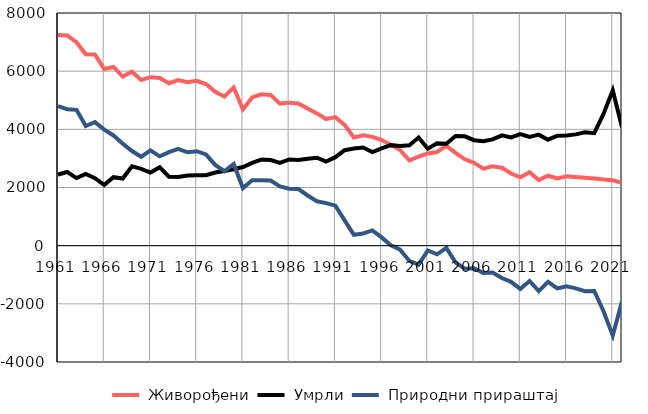
| Category |  Живорођени |  Умрли |  Природни прираштај |
|---|---|---|---|
| 1961.0 | 7244 | 2448 | 4796 |
| 1962.0 | 7228 | 2534 | 4694 |
| 1963.0 | 6995 | 2325 | 4670 |
| 1964.0 | 6582 | 2469 | 4113 |
| 1965.0 | 6571 | 2322 | 4249 |
| 1966.0 | 6076 | 2087 | 3989 |
| 1967.0 | 6144 | 2355 | 3789 |
| 1968.0 | 5815 | 2307 | 3508 |
| 1969.0 | 5981 | 2727 | 3254 |
| 1970.0 | 5699 | 2642 | 3057 |
| 1971.0 | 5793 | 2516 | 3277 |
| 1972.0 | 5768 | 2696 | 3072 |
| 1973.0 | 5585 | 2369 | 3216 |
| 1974.0 | 5692 | 2362 | 3330 |
| 1975.0 | 5623 | 2411 | 3212 |
| 1976.0 | 5668 | 2421 | 3247 |
| 1977.0 | 5557 | 2421 | 3136 |
| 1978.0 | 5292 | 2515 | 2777 |
| 1979.0 | 5127 | 2569 | 2558 |
| 1980.0 | 5441 | 2630 | 2811 |
| 1981.0 | 4685 | 2705 | 1980 |
| 1982.0 | 5097 | 2846 | 2251 |
| 1983.0 | 5206 | 2960 | 2246 |
| 1984.0 | 5180 | 2942 | 2238 |
| 1985.0 | 4885 | 2848 | 2037 |
| 1986.0 | 4918 | 2963 | 1955 |
| 1987.0 | 4891 | 2944 | 1947 |
| 1988.0 | 4716 | 2990 | 1726 |
| 1989.0 | 4548 | 3023 | 1525 |
| 1990.0 | 4353 | 2890 | 1463 |
| 1991.0 | 4419 | 3043 | 1376 |
| 1992.0 | 4154 | 3283 | 871 |
| 1993.0 | 3719 | 3344 | 375 |
| 1994.0 | 3795 | 3374 | 421 |
| 1995.0 | 3742 | 3216 | 526 |
| 1996.0 | 3631 | 3347 | 284 |
| 1997.0 | 3468 | 3456 | 12 |
| 1998.0 | 3286 | 3426 | -140 |
| 1999.0 | 2930 | 3454 | -524 |
| 2000.0 | 3064 | 3717 | -653 |
| 2001.0 | 3171 | 3334 | -163 |
| 2002.0 | 3221 | 3517 | -296 |
| 2003.0 | 3431 | 3507 | -76 |
| 2004.0 | 3189 | 3771 | -582 |
| 2005.0 | 2970 | 3760 | -790 |
| 2006.0 | 2848 | 3626 | -778 |
| 2007.0 | 2648 | 3591 | -943 |
| 2008.0 | 2732 | 3656 | -924 |
| 2009.0 | 2681 | 3795 | -1114 |
| 2010.0 | 2481 | 3724 | -1243 |
| 2011.0 | 2348 | 3835 | -1487 |
| 2012.0 | 2526 | 3740 | -1214 |
| 2013.0 | 2256 | 3818 | -1562 |
| 2014.0 | 2404 | 3645 | -1241 |
| 2015.0 | 2314 | 3782 | -1468 |
| 2016.0 | 2388 | 3786 | -1398 |
| 2017.0 | 2358 | 3827 | -1469 |
| 2018.0 | 2337 | 3901 | -1564 |
| 2019.0 | 2313 | 3869 | -1556 |
| 2020.0 | 2274 | 4528 | -2254 |
| 2021.0 | 2247 | 5340 | -3093 |
| 2022.0 | 2163 | 4073 | -1910 |